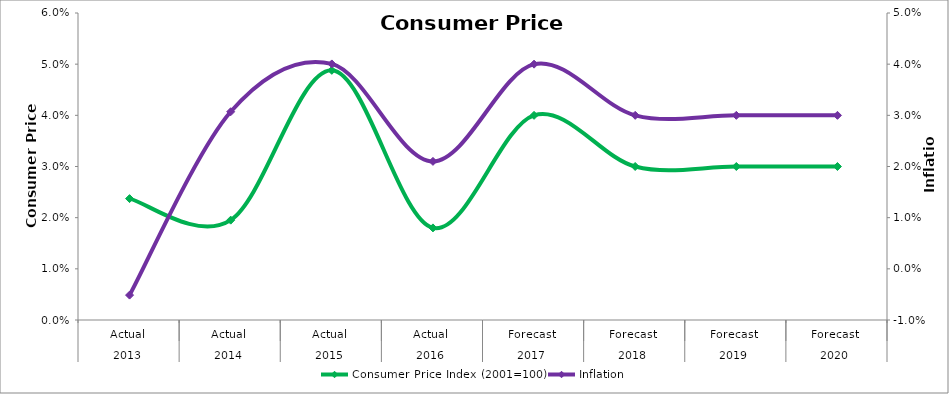
| Category | Consumer Price Index (2001=100) |
|---|---|
| 0 | 0.024 |
| 1 | 0.02 |
| 2 | 0.049 |
| 3 | 0.018 |
| 4 | 0.04 |
| 5 | 0.03 |
| 6 | 0.03 |
| 7 | 0.03 |